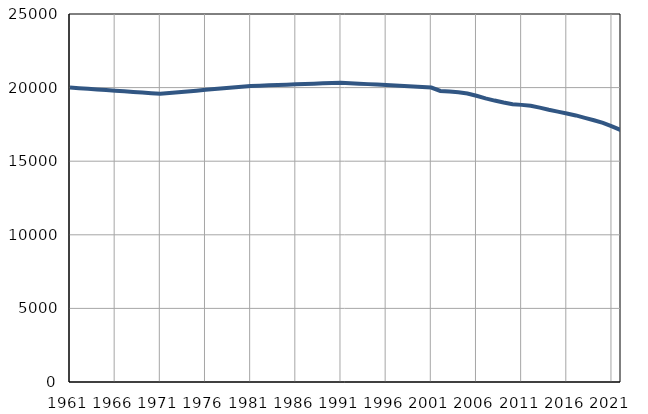
| Category | Population
size |
|---|---|
| 1961.0 | 20001 |
| 1962.0 | 19959 |
| 1963.0 | 19917 |
| 1964.0 | 19875 |
| 1965.0 | 19833 |
| 1966.0 | 19791 |
| 1967.0 | 19749 |
| 1968.0 | 19707 |
| 1969.0 | 19665 |
| 1970.0 | 19623 |
| 1971.0 | 19581 |
| 1972.0 | 19634 |
| 1973.0 | 19687 |
| 1974.0 | 19740 |
| 1975.0 | 19793 |
| 1976.0 | 19846 |
| 1977.0 | 19899 |
| 1978.0 | 19952 |
| 1979.0 | 20005 |
| 1980.0 | 20058 |
| 1981.0 | 20111 |
| 1982.0 | 20133 |
| 1983.0 | 20156 |
| 1984.0 | 20178 |
| 1985.0 | 20201 |
| 1986.0 | 20223 |
| 1987.0 | 20245 |
| 1988.0 | 20268 |
| 1989.0 | 20290 |
| 1990.0 | 20313 |
| 1991.0 | 20335 |
| 1992.0 | 20302 |
| 1993.0 | 20269 |
| 1994.0 | 20236 |
| 1995.0 | 20203 |
| 1996.0 | 20170 |
| 1997.0 | 20137 |
| 1998.0 | 20104 |
| 1999.0 | 20071 |
| 2000.0 | 20038 |
| 2001.0 | 20005 |
| 2002.0 | 19772 |
| 2003.0 | 19727 |
| 2004.0 | 19690 |
| 2005.0 | 19602 |
| 2006.0 | 19443 |
| 2007.0 | 19272 |
| 2008.0 | 19119 |
| 2009.0 | 18987 |
| 2010.0 | 18875 |
| 2011.0 | 18826 |
| 2012.0 | 18765 |
| 2013.0 | 18642 |
| 2014.0 | 18495 |
| 2015.0 | 18369 |
| 2016.0 | 18240 |
| 2017.0 | 18109 |
| 2018.0 | 17947 |
| 2019.0 | 17779 |
| 2020.0 | 17609 |
| 2021.0 | 17368 |
| 2022.0 | 17111 |